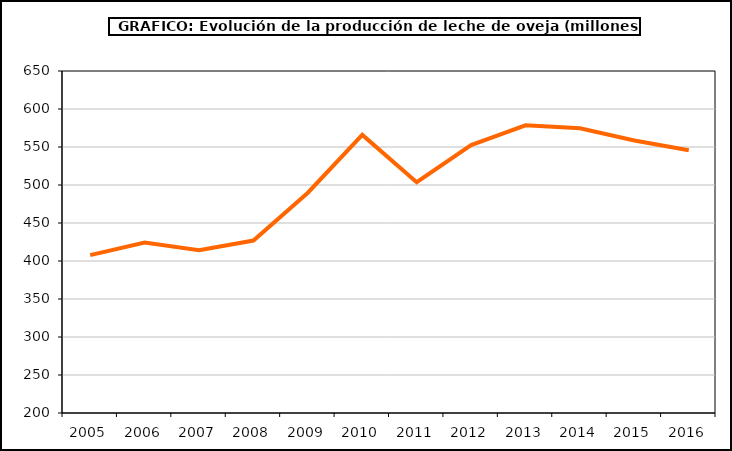
| Category | leche oveja |
|---|---|
| 2005.0 | 407.764 |
| 2006.0 | 424.332 |
| 2007.0 | 414.211 |
| 2008.0 | 426.918 |
| 2009.0 | 489.823 |
| 2010.0 | 565.948 |
| 2011.0 | 503.6 |
| 2012.0 | 552.517 |
| 2013.0 | 578.581 |
| 2014.0 | 574.682 |
| 2015.0 | 558.55 |
| 2016.0 | 545.652 |